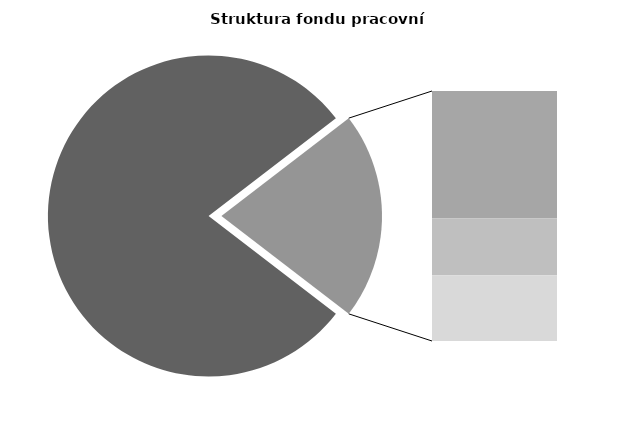
| Category | Series 0 |
|---|---|
| Průměrná měsíční odpracovaná doba bez přesčasu | 135.979 |
| Dovolená | 18.255 |
| Nemoc | 8.176 |
| Jiné | 9.408 |